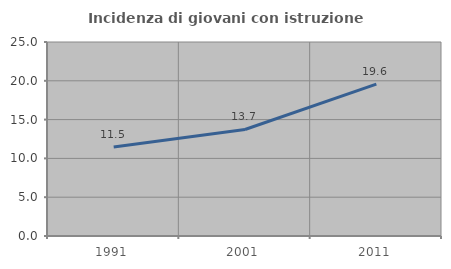
| Category | Incidenza di giovani con istruzione universitaria |
|---|---|
| 1991.0 | 11.475 |
| 2001.0 | 13.725 |
| 2011.0 | 19.565 |